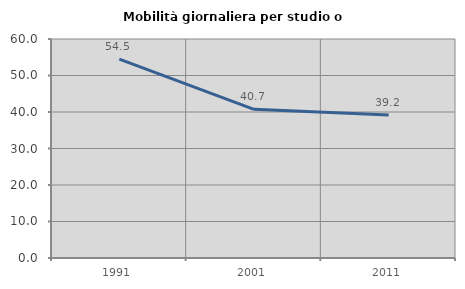
| Category | Mobilità giornaliera per studio o lavoro |
|---|---|
| 1991.0 | 54.488 |
| 2001.0 | 40.733 |
| 2011.0 | 39.161 |